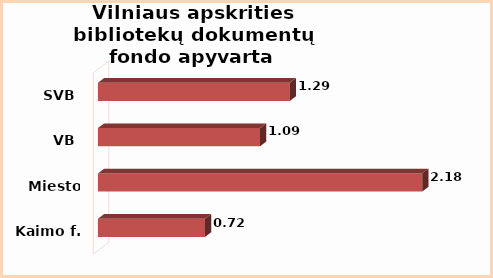
| Category | Series 0 |
|---|---|
| Kaimo f. | 0.72 |
| Miesto f. | 2.18 |
| VB | 1.09 |
| SVB | 1.29 |